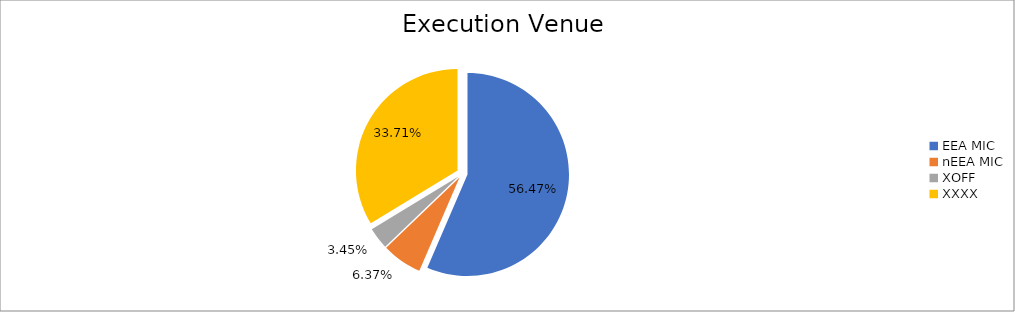
| Category | Series 0 |
|---|---|
| EEA MIC | 6725070.984 |
| nEEA MIC | 758846.31 |
| XOFF | 410348.862 |
| XXXX | 4013786.561 |